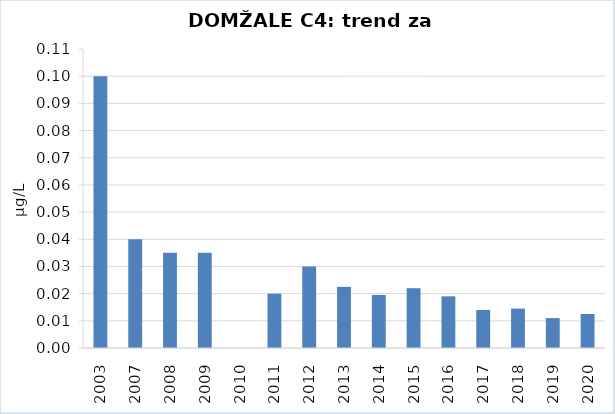
| Category | Vsota |
|---|---|
| 2003 | 0.1 |
| 2007 | 0.04 |
| 2008 | 0.035 |
| 2009 | 0.035 |
| 2010 | 0 |
| 2011 | 0.02 |
| 2012 | 0.03 |
| 2013 | 0.022 |
| 2014 | 0.02 |
| 2015 | 0.022 |
| 2016 | 0.019 |
| 2017 | 0.014 |
| 2018 | 0.014 |
| 2019 | 0.011 |
| 2020 | 0.012 |